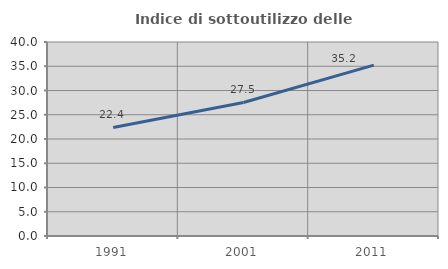
| Category | Indice di sottoutilizzo delle abitazioni  |
|---|---|
| 1991.0 | 22.382 |
| 2001.0 | 27.535 |
| 2011.0 | 35.232 |